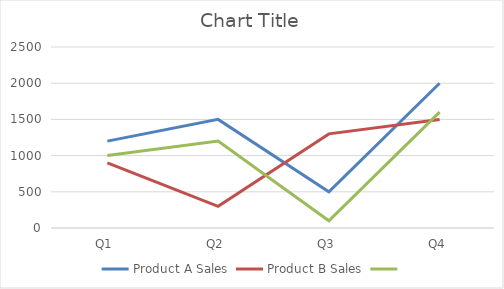
| Category | Product A Sales | Product B Sales | Series 2 |
|---|---|---|---|
| Q1 | 1200 | 900 | 1000 |
| Q2 | 1500 | 300 | 1200 |
| Q3 | 500 | 1300 | 100 |
| Q4 | 2000 | 1500 | 1600 |